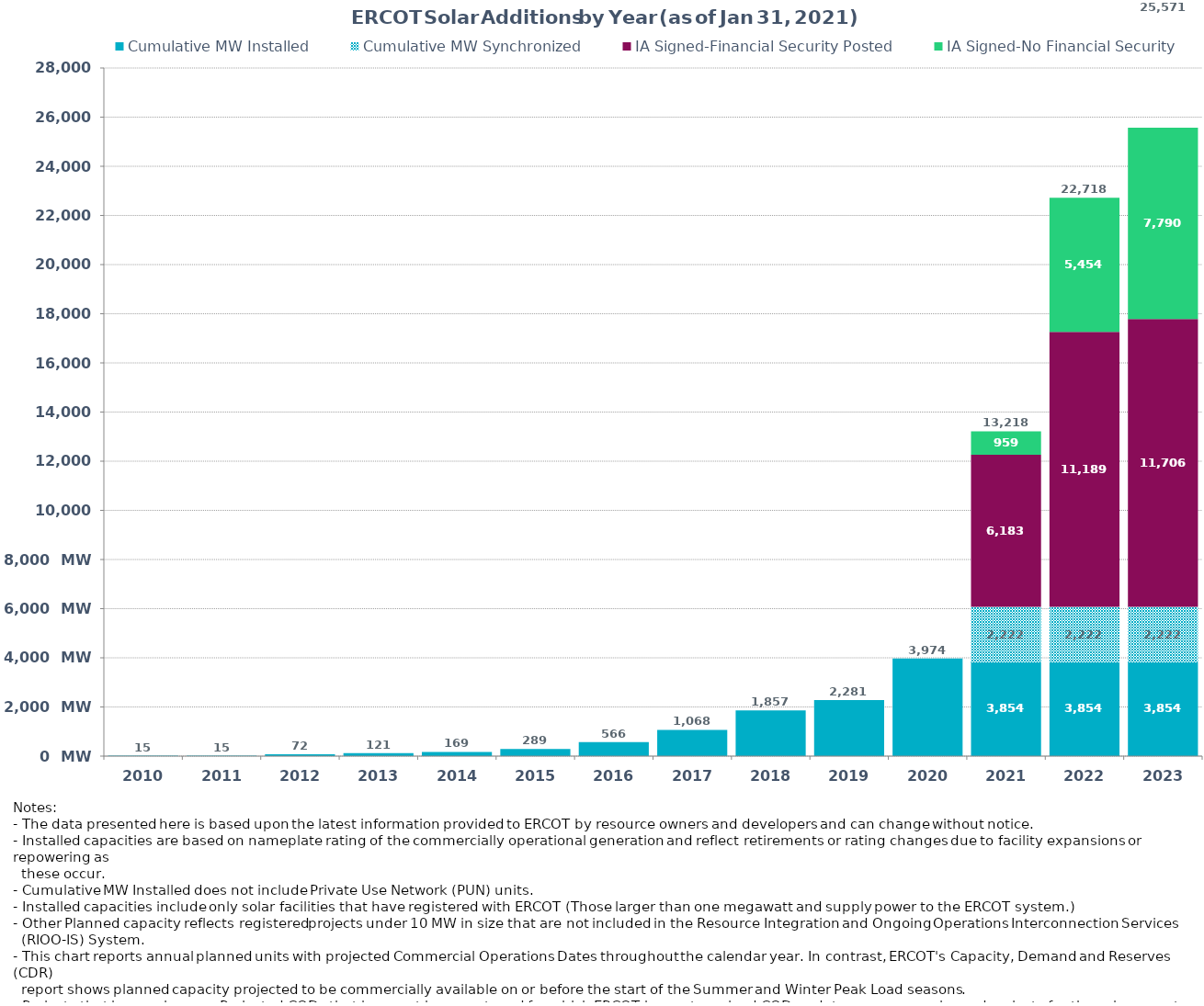
| Category | Cumulative MW Installed | Cumulative MW Synchronized | IA Signed-Financial Security Posted  | IA Signed-No Financial Security  | Other Planned | Cumulative Installed and Planned |
|---|---|---|---|---|---|---|
| 2010.0 | 15 | 0 | 0 | 0 | 0 | 15 |
| 2011.0 | 15 | 0 | 0 | 0 | 0 | 15 |
| 2012.0 | 72.3 | 0 | 0 | 0 | 0 | 72.3 |
| 2013.0 | 121.2 | 0 | 0 | 0 | 0 | 121.2 |
| 2014.0 | 168.7 | 0 | 0 | 0 | 0 | 168.7 |
| 2015.0 | 289.28 | 0 | 0 | 0 | 0 | 289.28 |
| 2016.0 | 565.78 | 0 | 0 | 0 | 0 | 565.78 |
| 2017.0 | 1067.78 | 0 | 0 | 0 | 0 | 1067.78 |
| 2018.0 | 1856.78 | 0 | 0 | 0 | 0 | 1856.78 |
| 2019.0 | 2281.38 | 0 | 0 | 0 | 0 | 2281.38 |
| 2020.0 | 3973.5 | 0 | 0 | 0 | 0 | 3973.5 |
| 2021.0 | 3853.91 | 2221.7 | 6183.46 | 958.89 | 0 | 13217.96 |
| 2022.0 | 3853.91 | 2221.7 | 11188.87 | 5453.63 | 0 | 22718.11 |
| 2023.0 | 3853.91 | 2221.7 | 11706.22 | 7789.53 | 0 | 25571.36 |